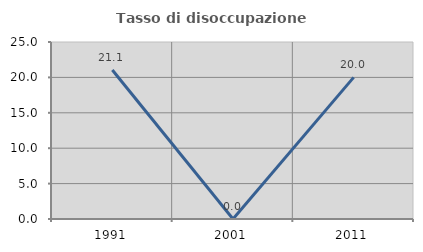
| Category | Tasso di disoccupazione giovanile  |
|---|---|
| 1991.0 | 21.053 |
| 2001.0 | 0 |
| 2011.0 | 20 |